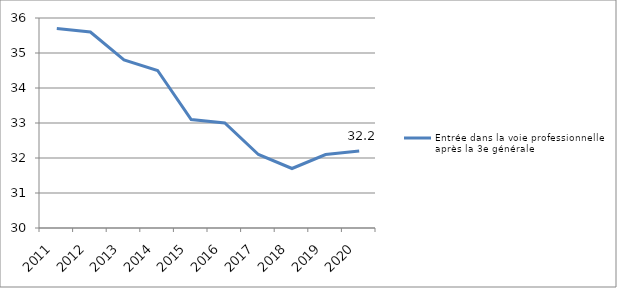
| Category | Entrée dans la voie professionnelle après la 3e générale |
|---|---|
| 2011.0 | 35.7 |
| 2012.0 | 35.6 |
| 2013.0 | 34.8 |
| 2014.0 | 34.5 |
| 2015.0 | 33.1 |
| 2016.0 | 33 |
| 2017.0 | 32.1 |
| 2018.0 | 31.7 |
| 2019.0 | 32.1 |
| 2020.0 | 32.2 |